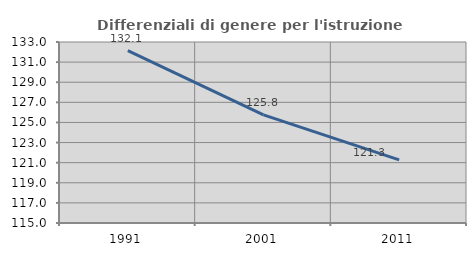
| Category | Differenziali di genere per l'istruzione superiore |
|---|---|
| 1991.0 | 132.141 |
| 2001.0 | 125.753 |
| 2011.0 | 121.275 |